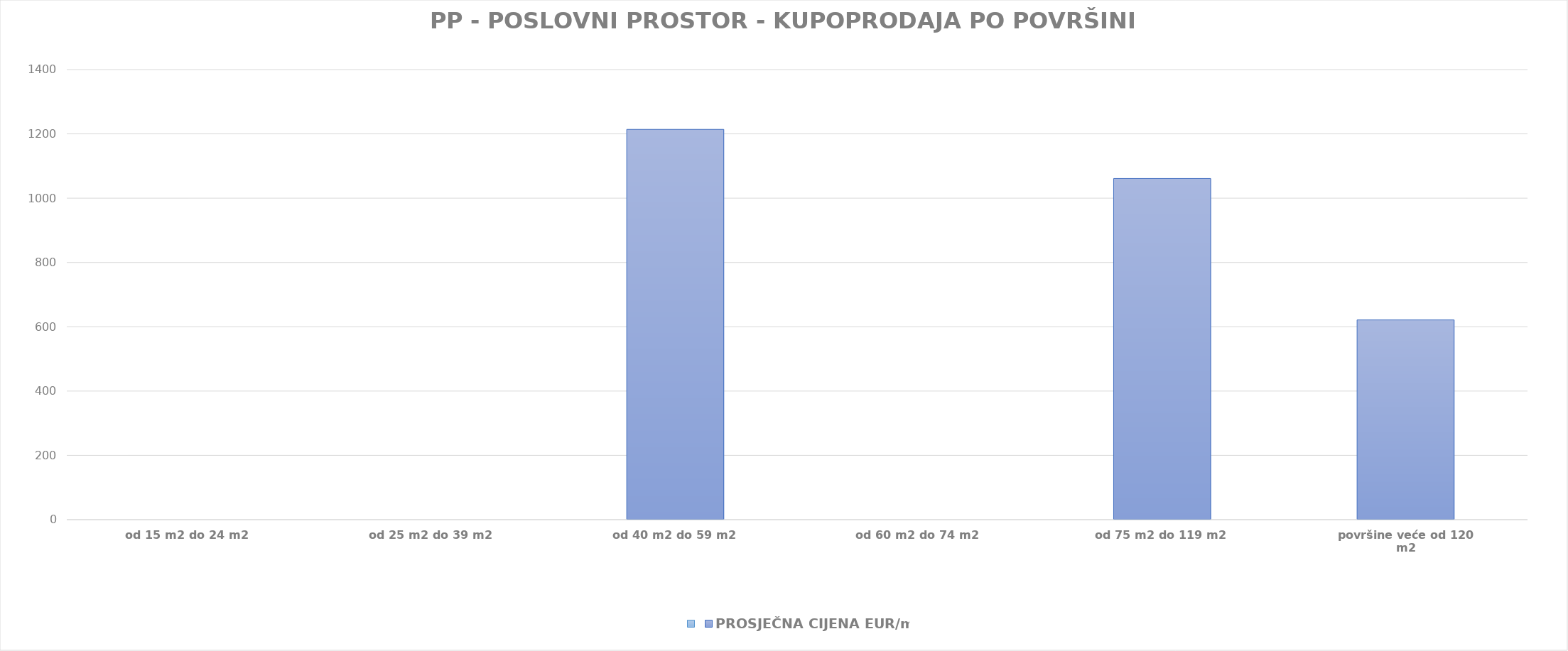
| Category | Series 0 | PROSJEČNA CIJENA EUR/m2 |
|---|---|---|
| od 15 m2 do 24 m2 |  | 0 |
| od 25 m2 do 39 m2 |  | 0 |
| od 40 m2 do 59 m2 |  | 1903-04-27 22:55:53 |
| od 60 m2 do 74 m2 |  | 0 |
| od 75 m2 do 119 m2 |  | 1902-11-26 04:13:14 |
| površine veće od 120 m2 |  | 1901-09-12 07:21:44 |